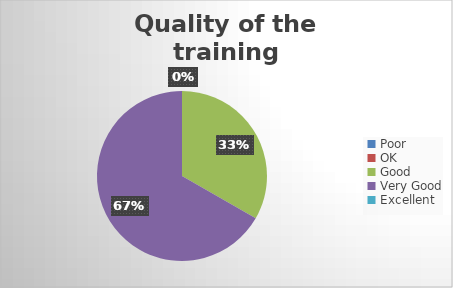
| Category | Quality of the training organization (%) |
|---|---|
| Poor | 0 |
| OK | 0 |
| Good | 3.07 |
| Very Good | 6.15 |
| Excellent | 0 |